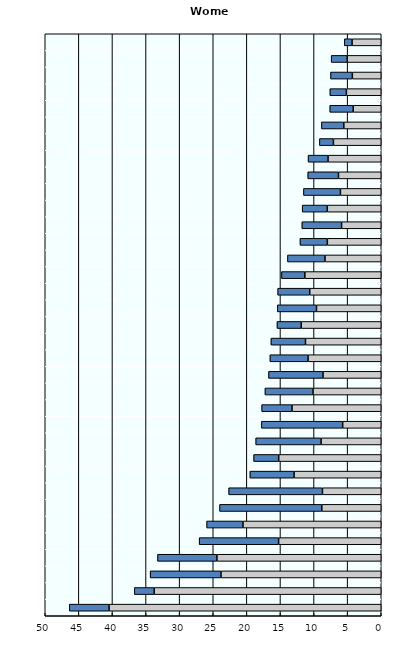
| Category | Inactive | Unemployed |
|---|---|---|
| Turkey  | 40.505 | 5.913 |
| Mexico  | 33.792 | 2.954 |
| Colombia  | 23.845 | 10.544 |
| Costa Rica  | 24.453 | 8.839 |
| Italy  | 15.271 | 11.823 |
| Chile 1 | 20.578 | 5.41 |
| Greece  | 8.844 | 15.219 |
| Spain  | 8.751 | 13.955 |
| Poland  | 12.97 | 6.579 |
| Israel  | 15.258 | 3.734 |
| France  | 8.953 | 9.729 |
| Portugal  | 5.738 | 12.101 |
| Hungary  | 13.277 | 4.519 |
| Ireland 1 | 10.155 | 7.149 |
| Slovak Republic  | 8.669 | 8.111 |
| OECD average  | 10.892 | 5.676 |
| United Kingdom  | 11.274 | 5.143 |
| United States  | 11.903 | 3.611 |
| Latvia  | 9.634 | 5.831 |
| New Zealand  | 10.642 | 4.771 |
| Estonia  | 11.369 | 3.483 |
| Finland  | 8.372 | 5.581 |
| Canada  | 8.02 | 4.074 |
| Belgium  | 5.905 | 5.908 |
| Australia  | 8.029 | 3.733 |
| Austria | 6.072 | 5.507 |
| Lithuania  | 6.363 | 4.574 |
| Germany  | 7.919 | 2.966 |
| Norway  | 7.118 | 2.083 |
| Sweden  | 5.569 | 3.332 |
| Switzerland  | 4.179 | 3.483 |
| Netherlands  | 5.189 | 2.455 |
| Slovenia  | 4.301 | 3.248 |
| Denmark  | 5.064 | 2.386 |
| Iceland  | 4.342 | 1.153 |